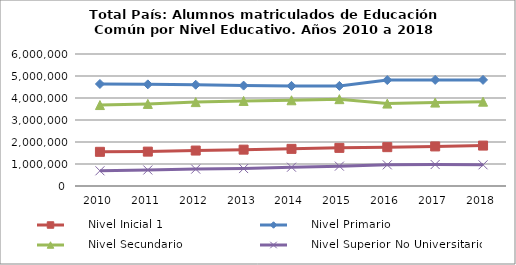
| Category |      Nivel Inicial 1 |      Nivel Primario |      Nivel Secundario |      Nivel Superior No Universitario |
|---|---|---|---|---|
| 2010.0 | 1553418 | 4637463 | 3679628 | 691007 |
| 2011.0 | 1563013 | 4620306 | 3731208 | 727444 |
| 2012.0 | 1610845 | 4603422 | 3813545 | 767698 |
| 2013.0 | 1652657 | 4563491 | 3866119 | 793018 |
| 2014.0 | 1687543 | 4550923 | 3896467 | 853853 |
| 2015.0 | 1733374 | 4550365 | 3946834 | 902316 |
| 2016.0 | 1765405 | 4814965 | 3746170 | 961048 |
| 2017.0 | 1798831 | 4822602 | 3791310 | 976466 |
| 2018.0 | 1836781 | 4822689 | 3832054 | 962493 |